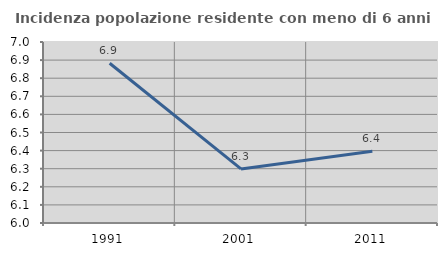
| Category | Incidenza popolazione residente con meno di 6 anni |
|---|---|
| 1991.0 | 6.883 |
| 2001.0 | 6.299 |
| 2011.0 | 6.396 |